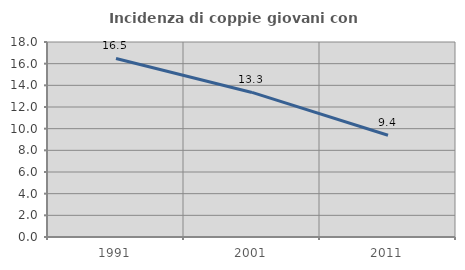
| Category | Incidenza di coppie giovani con figli |
|---|---|
| 1991.0 | 16.484 |
| 2001.0 | 13.345 |
| 2011.0 | 9.394 |